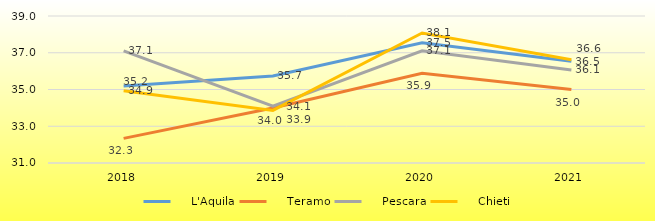
| Category |     L'Aquila |     Teramo |     Pescara |     Chieti |
|---|---|---|---|---|
| 2018 | 35.189 | 32.341 | 37.101 | 34.926 |
| 2019 | 35.737 | 33.997 | 34.097 | 33.86 |
| 2020 | 37.548 | 35.883 | 37.107 | 38.075 |
| 2021 | 36.539 | 34.994 | 36.063 | 36.614 |